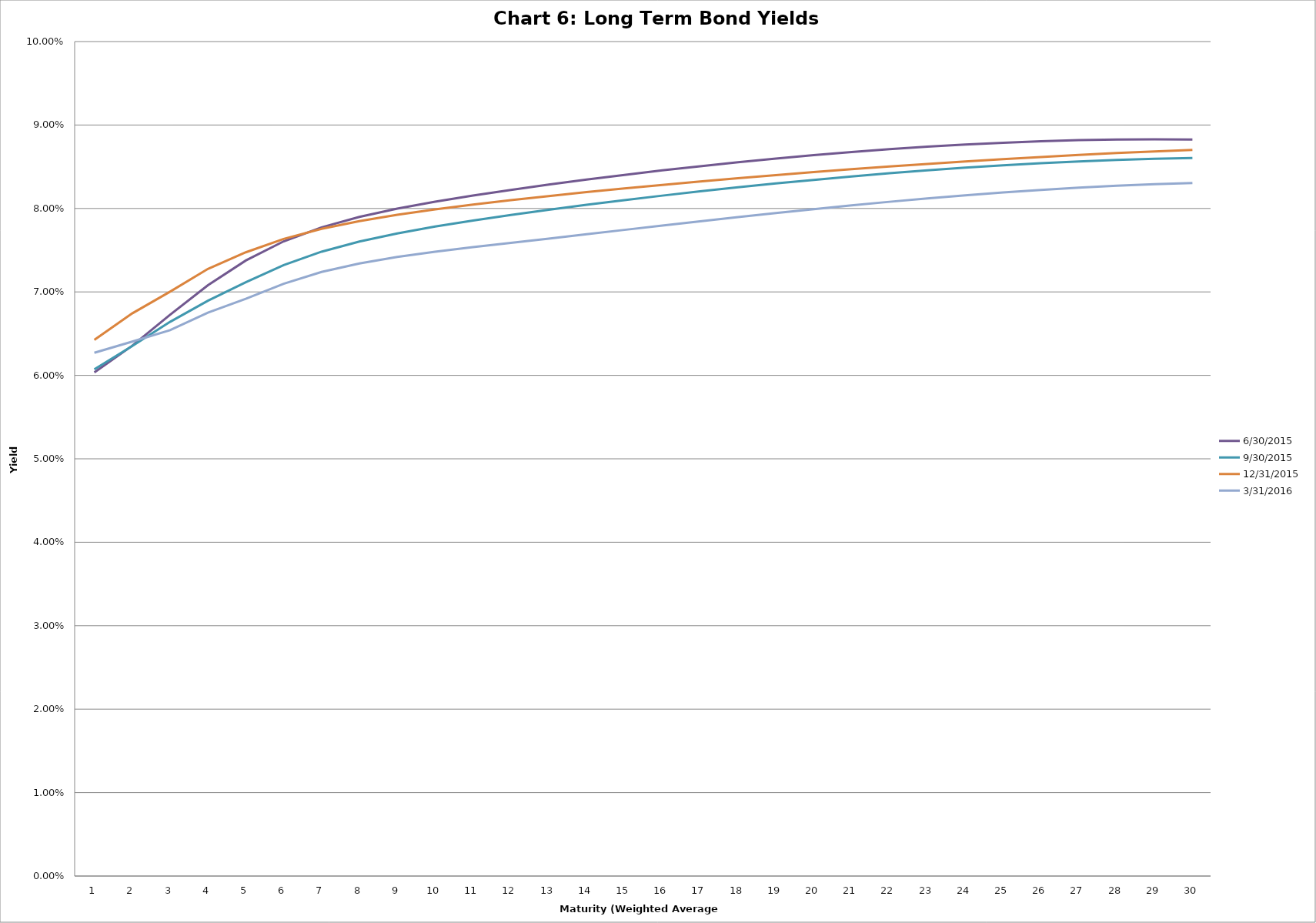
| Category | 6/30/2015 | 9/30/2015 | 12/31/2015 | 3/31/2016 |
|---|---|---|---|---|
| 0 | 0.06 | 0.061 | 0.064 | 0.063 |
| 1 | 0.064 | 0.064 | 0.067 | 0.064 |
| 2 | 0.067 | 0.066 | 0.07 | 0.065 |
| 3 | 0.071 | 0.069 | 0.073 | 0.068 |
| 4 | 0.074 | 0.071 | 0.075 | 0.069 |
| 5 | 0.076 | 0.073 | 0.076 | 0.071 |
| 6 | 0.078 | 0.075 | 0.078 | 0.072 |
| 7 | 0.079 | 0.076 | 0.078 | 0.073 |
| 8 | 0.08 | 0.077 | 0.079 | 0.074 |
| 9 | 0.081 | 0.078 | 0.08 | 0.075 |
| 10 | 0.082 | 0.079 | 0.08 | 0.075 |
| 11 | 0.082 | 0.079 | 0.081 | 0.076 |
| 12 | 0.083 | 0.08 | 0.081 | 0.076 |
| 13 | 0.083 | 0.08 | 0.082 | 0.077 |
| 14 | 0.084 | 0.081 | 0.082 | 0.077 |
| 15 | 0.085 | 0.082 | 0.083 | 0.078 |
| 16 | 0.085 | 0.082 | 0.083 | 0.078 |
| 17 | 0.086 | 0.083 | 0.084 | 0.079 |
| 18 | 0.086 | 0.083 | 0.084 | 0.079 |
| 19 | 0.086 | 0.083 | 0.084 | 0.08 |
| 20 | 0.087 | 0.084 | 0.085 | 0.08 |
| 21 | 0.087 | 0.084 | 0.085 | 0.081 |
| 22 | 0.087 | 0.085 | 0.085 | 0.081 |
| 23 | 0.088 | 0.085 | 0.086 | 0.082 |
| 24 | 0.088 | 0.085 | 0.086 | 0.082 |
| 25 | 0.088 | 0.085 | 0.086 | 0.082 |
| 26 | 0.088 | 0.086 | 0.086 | 0.082 |
| 27 | 0.088 | 0.086 | 0.087 | 0.083 |
| 28 | 0.088 | 0.086 | 0.087 | 0.083 |
| 29 | 0.088 | 0.086 | 0.087 | 0.083 |